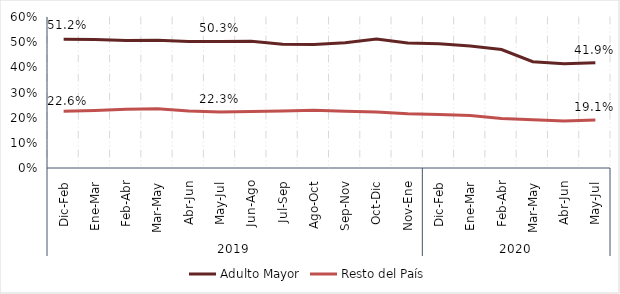
| Category | Adulto Mayor | Resto del País |
|---|---|---|
| 0 | 0.512 | 0.226 |
| 1 | 0.511 | 0.229 |
| 2 | 0.506 | 0.234 |
| 3 | 0.508 | 0.235 |
| 4 | 0.503 | 0.227 |
| 5 | 0.503 | 0.223 |
| 6 | 0.504 | 0.224 |
| 7 | 0.491 | 0.227 |
| 8 | 0.491 | 0.23 |
| 9 | 0.497 | 0.225 |
| 10 | 0.513 | 0.223 |
| 11 | 0.497 | 0.216 |
| 12 | 0.494 | 0.212 |
| 13 | 0.485 | 0.208 |
| 14 | 0.471 | 0.197 |
| 15 | 0.423 | 0.191 |
| 16 | 0.414 | 0.187 |
| 17 | 0.419 | 0.191 |